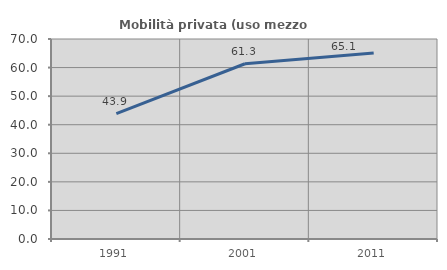
| Category | Mobilità privata (uso mezzo privato) |
|---|---|
| 1991.0 | 43.874 |
| 2001.0 | 61.333 |
| 2011.0 | 65.079 |